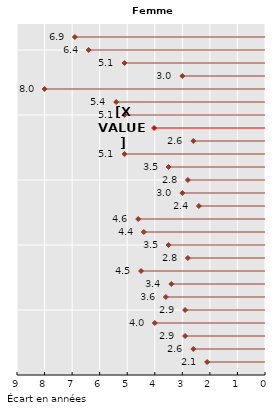
| Category | Series 0 |
|---|---|
| 2.1000000000000014 | 1 |
| 0.0 | 1 |
| 2.6000000000000014 | 2 |
| 0.0 | 2 |
| 2.8999999999999986 | 3 |
| 0.0 | 3 |
| 4.0 | 4 |
| 0.0 | 4 |
| 2.8999999999999986 | 5 |
| 0.0 | 5 |
| 3.6000000000000014 | 6 |
| 0.0 | 6 |
| 3.3999999999999986 | 7 |
| 0.0 | 7 |
| 4.5 | 8 |
| 0.0 | 8 |
| 2.799999999999997 | 9 |
| 0.0 | 9 |
| 3.5 | 10 |
| 0.0 | 10 |
| 4.399999999999999 | 11 |
| 0.0 | 11 |
| 4.600000000000001 | 12 |
| 0.0 | 12 |
| 2.3999999999999986 | 13 |
| 0.0 | 13 |
| 3.0 | 14 |
| 0.0 | 14 |
| 2.8000000000000043 | 15 |
| 0.0 | 15 |
| 3.5 | 16 |
| 0.0 | 16 |
| 5.100000000000001 | 17 |
| 0.0 | 17 |
| 2.6000000000000014 | 18 |
| 0.0 | 18 |
| 4.024000000000001 | 19 |
| 0.0 | 19 |
| 5.100000000000001 | 20 |
| 0.0 | 20 |
| 5.399999999999999 | 21 |
| 0.0 | 21 |
| 8.0 | 22 |
| 0.0 | 22 |
| 3.0 | 23 |
| 0.0 | 23 |
| 5.100000000000001 | 24 |
| 0.0 | 24 |
| 6.399999999999999 | 25 |
| 0.0 | 25 |
| 6.899999999999999 | 26 |
| 0.0 | 26 |